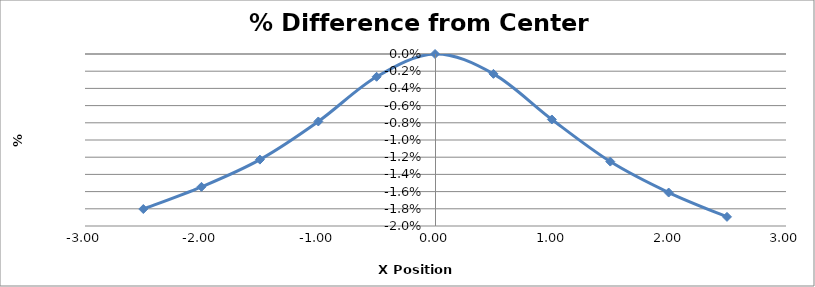
| Category | Series 0 |
|---|---|
| -2.5010000000000003 | -0.018 |
| -2.003 | -0.015 |
| -1.5030000000000001 | -0.012 |
| -1.0030000000000001 | -0.008 |
| -0.5040000000000004 | -0.003 |
| -0.004000000000000448 | 0 |
| 0.49599999999999955 | -0.002 |
| 0.9959999999999996 | -0.008 |
| 1.4959999999999996 | -0.013 |
| 1.9959999999999996 | -0.016 |
| 2.495 | -0.019 |